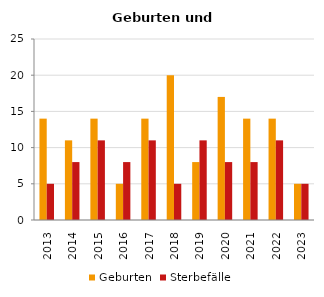
| Category | Geburten | Sterbefälle |
|---|---|---|
| 2013.0 | 14 | 5 |
| 2014.0 | 11 | 8 |
| 2015.0 | 14 | 11 |
| 2016.0 | 5 | 8 |
| 2017.0 | 14 | 11 |
| 2018.0 | 20 | 5 |
| 2019.0 | 8 | 11 |
| 2020.0 | 17 | 8 |
| 2021.0 | 14 | 8 |
| 2022.0 | 14 | 11 |
| 2023.0 | 5 | 5 |